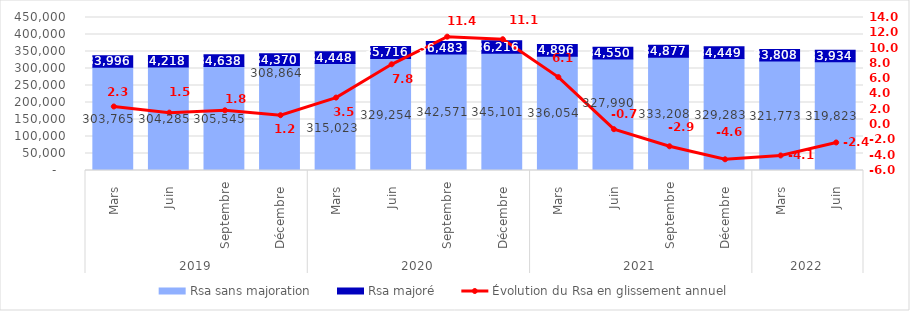
| Category | Rsa sans majoration | Rsa majoré |
|---|---|---|
| 0 | 303765 | 33996 |
| 1 | 304285 | 34218 |
| 2 | 305545 | 34638 |
| 3 | 308864 | 34370 |
| 4 | 315023 | 34448 |
| 5 | 329254 | 35716 |
| 6 | 342571 | 36483 |
| 7 | 345101 | 36216 |
| 8 | 336054 | 34896 |
| 9 | 327990 | 34550 |
| 10 | 333208 | 34877 |
| 11 | 329283 | 34449 |
| 12 | 321773 | 33808 |
| 13 | 319823 | 33934 |